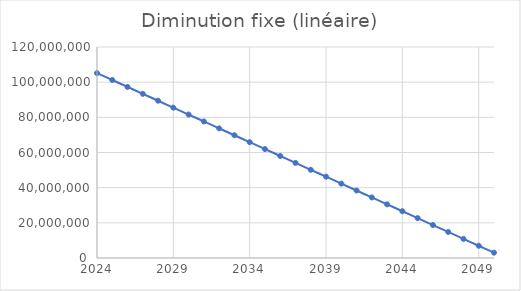
| Category | Emissions (t eqCO2) |
|---|---|
| 2024.0 | 105153500 |
| 2025.0 | 101225519.231 |
| 2026.0 | 97297538.462 |
| 2027.0 | 93369557.692 |
| 2028.0 | 89441576.923 |
| 2029.0 | 85513596.154 |
| 2030.0 | 81585615.385 |
| 2031.0 | 77657634.615 |
| 2032.0 | 73729653.846 |
| 2033.0 | 69801673.077 |
| 2034.0 | 65873692.308 |
| 2035.0 | 61945711.538 |
| 2036.0 | 58017730.769 |
| 2037.0 | 54089750 |
| 2038.0 | 50161769.231 |
| 2039.0 | 46233788.462 |
| 2040.0 | 42305807.692 |
| 2041.0 | 38377826.923 |
| 2042.0 | 34449846.154 |
| 2043.0 | 30521865.385 |
| 2044.0 | 26593884.615 |
| 2045.0 | 22665903.846 |
| 2046.0 | 18737923.077 |
| 2047.0 | 14809942.308 |
| 2048.0 | 10881961.538 |
| 2049.0 | 6953980.769 |
| 2050.0 | 3026000 |